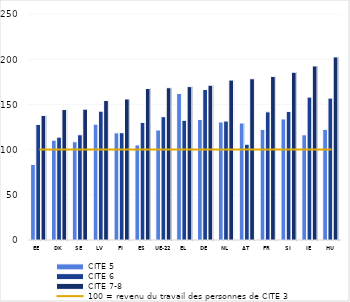
| Category | CITE 5 | CITE 6 | CITE 7-8 |
|---|---|---|---|
| EE | 83.595 | 127.849 | 137.717 |
| DK | 110.431 | 113.798 | 144.298 |
| SE | 108.684 | 116.444 | 144.773 |
| LV | 128.089 | 142.538 | 154.29 |
| FI | 118.516 | 118.684 | 156.014 |
| ES | 105.169 | 130.079 | 167.622 |
| UE-22 | 121.709 | 136.413 | 168.445 |
| EL | 162.05 | 132.421 | 169.669 |
| DE | 133.354 | 166.506 | 171.194 |
| NL | 130.549 | 131.607 | 176.929 |
| AT | 129.441 | 105.96 | 178.389 |
| FR | 122.262 | 141.761 | 180.953 |
| SI | 133.895 | 142.284 | 185.564 |
| IE | 116.341 | 158.053 | 192.56 |
| HU | 122.385 | 156.956 | 202.53 |